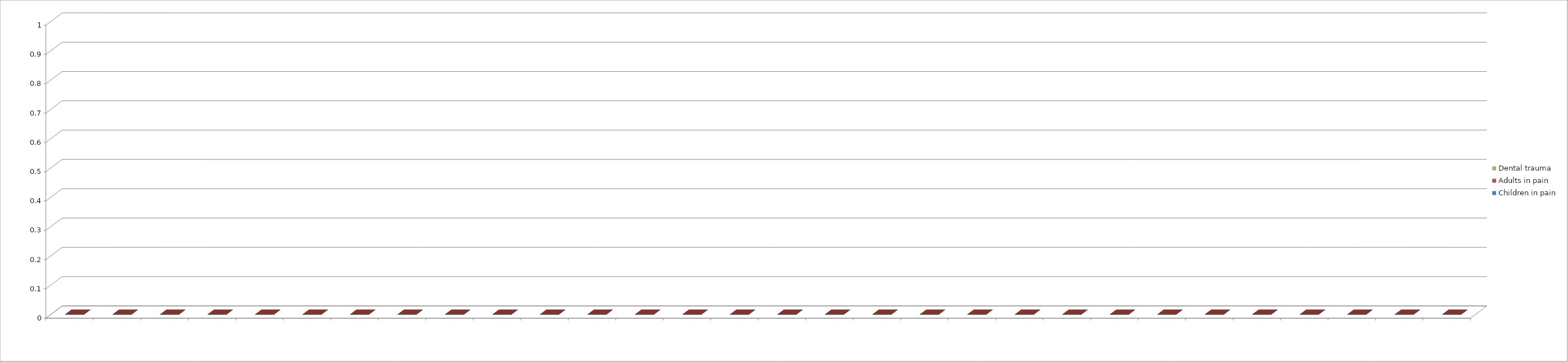
| Category | Children in pain | Adults in pain | Dental trauma |
|---|---|---|---|
| 0 | 0 | 0 | 0 |
| 1 | 0 | 0 | 0 |
| 2 | 0 | 0 | 0 |
| 3 | 0 | 0 | 0 |
| 4 | 0 | 0 | 0 |
| 5 | 0 | 0 | 0 |
| 6 | 0 | 0 | 0 |
| 7 | 0 | 0 | 0 |
| 8 | 0 | 0 | 0 |
| 9 | 0 | 0 | 0 |
| 10 | 0 | 0 | 0 |
| 11 | 0 | 0 | 0 |
| 12 | 0 | 0 | 0 |
| 13 | 0 | 0 | 0 |
| 14 | 0 | 0 | 0 |
| 15 | 0 | 0 | 0 |
| 16 | 0 | 0 | 0 |
| 17 | 0 | 0 | 0 |
| 18 | 0 | 0 | 0 |
| 19 | 0 | 0 | 0 |
| 20 | 0 | 0 | 0 |
| 21 | 0 | 0 | 0 |
| 22 | 0 | 0 | 0 |
| 23 | 0 | 0 | 0 |
| 24 | 0 | 0 | 0 |
| 25 | 0 | 0 | 0 |
| 26 | 0 | 0 | 0 |
| 27 | 0 | 0 | 0 |
| 28 | 0 | 0 | 0 |
| 29 | 0 | 0 | 0 |